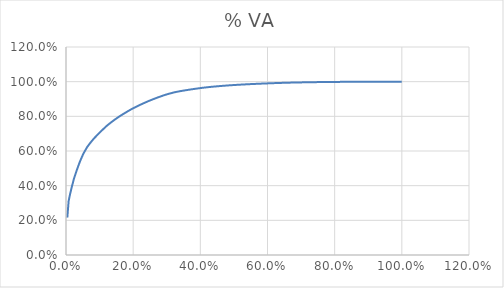
| Category | % VA |
|---|---|
| 0.00392156862745098 | 0.216 |
| 0.00784313725490196 | 0.311 |
| 0.011764705882352941 | 0.348 |
| 0.01568627450980392 | 0.38 |
| 0.0196078431372549 | 0.41 |
| 0.023529411764705882 | 0.439 |
| 0.027450980392156862 | 0.463 |
| 0.03137254901960784 | 0.485 |
| 0.03529411764705882 | 0.507 |
| 0.0392156862745098 | 0.527 |
| 0.043137254901960784 | 0.546 |
| 0.047058823529411764 | 0.564 |
| 0.050980392156862744 | 0.581 |
| 0.054901960784313725 | 0.595 |
| 0.058823529411764705 | 0.609 |
| 0.06274509803921569 | 0.622 |
| 0.06666666666666667 | 0.632 |
| 0.07058823529411765 | 0.642 |
| 0.07450980392156863 | 0.652 |
| 0.0784313725490196 | 0.661 |
| 0.08235294117647059 | 0.67 |
| 0.08627450980392157 | 0.678 |
| 0.09019607843137255 | 0.686 |
| 0.09411764705882353 | 0.694 |
| 0.09803921568627451 | 0.702 |
| 0.10196078431372549 | 0.709 |
| 0.10588235294117647 | 0.717 |
| 0.10980392156862745 | 0.724 |
| 0.11372549019607843 | 0.731 |
| 0.11764705882352941 | 0.738 |
| 0.12156862745098039 | 0.745 |
| 0.12549019607843137 | 0.752 |
| 0.12941176470588237 | 0.758 |
| 0.13333333333333333 | 0.764 |
| 0.13725490196078433 | 0.77 |
| 0.1411764705882353 | 0.775 |
| 0.1450980392156863 | 0.781 |
| 0.14901960784313725 | 0.786 |
| 0.15294117647058825 | 0.791 |
| 0.1568627450980392 | 0.797 |
| 0.1607843137254902 | 0.802 |
| 0.16470588235294117 | 0.806 |
| 0.16862745098039217 | 0.811 |
| 0.17254901960784313 | 0.816 |
| 0.17647058823529413 | 0.82 |
| 0.1803921568627451 | 0.825 |
| 0.1843137254901961 | 0.829 |
| 0.18823529411764706 | 0.834 |
| 0.19215686274509805 | 0.838 |
| 0.19607843137254902 | 0.842 |
| 0.2 | 0.847 |
| 0.20392156862745098 | 0.85 |
| 0.20784313725490197 | 0.854 |
| 0.21176470588235294 | 0.858 |
| 0.21568627450980393 | 0.862 |
| 0.2196078431372549 | 0.865 |
| 0.2235294117647059 | 0.869 |
| 0.22745098039215686 | 0.872 |
| 0.23137254901960785 | 0.876 |
| 0.23529411764705882 | 0.879 |
| 0.23921568627450981 | 0.882 |
| 0.24313725490196078 | 0.886 |
| 0.24705882352941178 | 0.889 |
| 0.25098039215686274 | 0.892 |
| 0.2549019607843137 | 0.895 |
| 0.25882352941176473 | 0.898 |
| 0.2627450980392157 | 0.901 |
| 0.26666666666666666 | 0.904 |
| 0.27058823529411763 | 0.907 |
| 0.27450980392156865 | 0.91 |
| 0.2784313725490196 | 0.913 |
| 0.2823529411764706 | 0.915 |
| 0.28627450980392155 | 0.918 |
| 0.2901960784313726 | 0.92 |
| 0.29411764705882354 | 0.923 |
| 0.2980392156862745 | 0.925 |
| 0.30196078431372547 | 0.928 |
| 0.3058823529411765 | 0.93 |
| 0.30980392156862746 | 0.932 |
| 0.3137254901960784 | 0.934 |
| 0.3176470588235294 | 0.936 |
| 0.3215686274509804 | 0.938 |
| 0.3254901960784314 | 0.94 |
| 0.32941176470588235 | 0.941 |
| 0.3333333333333333 | 0.943 |
| 0.33725490196078434 | 0.944 |
| 0.3411764705882353 | 0.946 |
| 0.34509803921568627 | 0.947 |
| 0.34901960784313724 | 0.948 |
| 0.35294117647058826 | 0.949 |
| 0.3568627450980392 | 0.951 |
| 0.3607843137254902 | 0.952 |
| 0.36470588235294116 | 0.953 |
| 0.3686274509803922 | 0.954 |
| 0.37254901960784315 | 0.955 |
| 0.3764705882352941 | 0.956 |
| 0.3803921568627451 | 0.958 |
| 0.3843137254901961 | 0.959 |
| 0.38823529411764707 | 0.96 |
| 0.39215686274509803 | 0.961 |
| 0.396078431372549 | 0.962 |
| 0.4 | 0.963 |
| 0.403921568627451 | 0.964 |
| 0.40784313725490196 | 0.965 |
| 0.4117647058823529 | 0.966 |
| 0.41568627450980394 | 0.967 |
| 0.4196078431372549 | 0.967 |
| 0.4235294117647059 | 0.968 |
| 0.42745098039215684 | 0.969 |
| 0.43137254901960786 | 0.97 |
| 0.43529411764705883 | 0.971 |
| 0.4392156862745098 | 0.971 |
| 0.44313725490196076 | 0.972 |
| 0.4470588235294118 | 0.973 |
| 0.45098039215686275 | 0.973 |
| 0.4549019607843137 | 0.974 |
| 0.4588235294117647 | 0.975 |
| 0.4627450980392157 | 0.975 |
| 0.4666666666666667 | 0.976 |
| 0.47058823529411764 | 0.977 |
| 0.4745098039215686 | 0.977 |
| 0.47843137254901963 | 0.978 |
| 0.4823529411764706 | 0.978 |
| 0.48627450980392156 | 0.979 |
| 0.49019607843137253 | 0.979 |
| 0.49411764705882355 | 0.98 |
| 0.4980392156862745 | 0.98 |
| 0.5019607843137255 | 0.981 |
| 0.5058823529411764 | 0.981 |
| 0.5098039215686274 | 0.982 |
| 0.5137254901960784 | 0.982 |
| 0.5176470588235295 | 0.983 |
| 0.5215686274509804 | 0.983 |
| 0.5254901960784314 | 0.983 |
| 0.5294117647058824 | 0.984 |
| 0.5333333333333333 | 0.984 |
| 0.5372549019607843 | 0.985 |
| 0.5411764705882353 | 0.985 |
| 0.5450980392156862 | 0.985 |
| 0.5490196078431373 | 0.986 |
| 0.5529411764705883 | 0.986 |
| 0.5568627450980392 | 0.987 |
| 0.5607843137254902 | 0.987 |
| 0.5647058823529412 | 0.987 |
| 0.5686274509803921 | 0.988 |
| 0.5725490196078431 | 0.988 |
| 0.5764705882352941 | 0.988 |
| 0.5803921568627451 | 0.989 |
| 0.5843137254901961 | 0.989 |
| 0.5882352941176471 | 0.989 |
| 0.592156862745098 | 0.99 |
| 0.596078431372549 | 0.99 |
| 0.6 | 0.99 |
| 0.6039215686274509 | 0.99 |
| 0.6078431372549019 | 0.991 |
| 0.611764705882353 | 0.991 |
| 0.615686274509804 | 0.991 |
| 0.6196078431372549 | 0.992 |
| 0.6235294117647059 | 0.992 |
| 0.6274509803921569 | 0.992 |
| 0.6313725490196078 | 0.992 |
| 0.6352941176470588 | 0.993 |
| 0.6392156862745098 | 0.993 |
| 0.6431372549019608 | 0.993 |
| 0.6470588235294118 | 0.993 |
| 0.6509803921568628 | 0.994 |
| 0.6549019607843137 | 0.994 |
| 0.6588235294117647 | 0.994 |
| 0.6627450980392157 | 0.994 |
| 0.6666666666666666 | 0.994 |
| 0.6705882352941176 | 0.995 |
| 0.6745098039215687 | 0.995 |
| 0.6784313725490196 | 0.995 |
| 0.6823529411764706 | 0.995 |
| 0.6862745098039216 | 0.995 |
| 0.6901960784313725 | 0.995 |
| 0.6941176470588235 | 0.996 |
| 0.6980392156862745 | 0.996 |
| 0.7019607843137254 | 0.996 |
| 0.7058823529411765 | 0.996 |
| 0.7098039215686275 | 0.996 |
| 0.7137254901960784 | 0.996 |
| 0.7176470588235294 | 0.996 |
| 0.7215686274509804 | 0.997 |
| 0.7254901960784313 | 0.997 |
| 0.7294117647058823 | 0.997 |
| 0.7333333333333333 | 0.997 |
| 0.7372549019607844 | 0.997 |
| 0.7411764705882353 | 0.997 |
| 0.7450980392156863 | 0.997 |
| 0.7490196078431373 | 0.997 |
| 0.7529411764705882 | 0.998 |
| 0.7568627450980392 | 0.998 |
| 0.7607843137254902 | 0.998 |
| 0.7647058823529411 | 0.998 |
| 0.7686274509803922 | 0.998 |
| 0.7725490196078432 | 0.998 |
| 0.7764705882352941 | 0.998 |
| 0.7803921568627451 | 0.998 |
| 0.7843137254901961 | 0.998 |
| 0.788235294117647 | 0.998 |
| 0.792156862745098 | 0.998 |
| 0.796078431372549 | 0.998 |
| 0.8 | 0.999 |
| 0.803921568627451 | 0.999 |
| 0.807843137254902 | 0.999 |
| 0.8117647058823529 | 0.999 |
| 0.8156862745098039 | 0.999 |
| 0.8196078431372549 | 0.999 |
| 0.8235294117647058 | 0.999 |
| 0.8274509803921568 | 0.999 |
| 0.8313725490196079 | 0.999 |
| 0.8352941176470589 | 0.999 |
| 0.8392156862745098 | 0.999 |
| 0.8431372549019608 | 0.999 |
| 0.8470588235294118 | 0.999 |
| 0.8509803921568627 | 0.999 |
| 0.8549019607843137 | 0.999 |
| 0.8588235294117647 | 0.999 |
| 0.8627450980392157 | 0.999 |
| 0.8666666666666667 | 0.999 |
| 0.8705882352941177 | 0.999 |
| 0.8745098039215686 | 0.999 |
| 0.8784313725490196 | 1 |
| 0.8823529411764706 | 1 |
| 0.8862745098039215 | 1 |
| 0.8901960784313725 | 1 |
| 0.8941176470588236 | 1 |
| 0.8980392156862745 | 1 |
| 0.9019607843137255 | 1 |
| 0.9058823529411765 | 1 |
| 0.9098039215686274 | 1 |
| 0.9137254901960784 | 1 |
| 0.9176470588235294 | 1 |
| 0.9215686274509803 | 1 |
| 0.9254901960784314 | 1 |
| 0.9294117647058824 | 1 |
| 0.9333333333333333 | 1 |
| 0.9372549019607843 | 1 |
| 0.9411764705882353 | 1 |
| 0.9450980392156862 | 1 |
| 0.9490196078431372 | 1 |
| 0.9529411764705882 | 1 |
| 0.9568627450980393 | 1 |
| 0.9607843137254902 | 1 |
| 0.9647058823529412 | 1 |
| 0.9686274509803922 | 1 |
| 0.9725490196078431 | 1 |
| 0.9764705882352941 | 1 |
| 0.9803921568627451 | 1 |
| 0.984313725490196 | 1 |
| 0.9882352941176471 | 1 |
| 0.9921568627450981 | 1 |
| 0.996078431372549 | 1 |
| 1.0 | 1 |